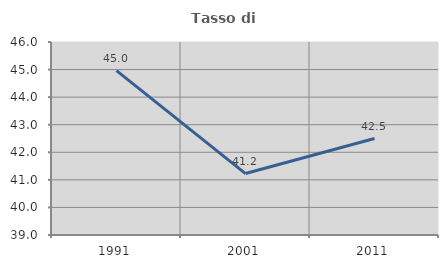
| Category | Tasso di occupazione   |
|---|---|
| 1991.0 | 44.961 |
| 2001.0 | 41.228 |
| 2011.0 | 42.5 |